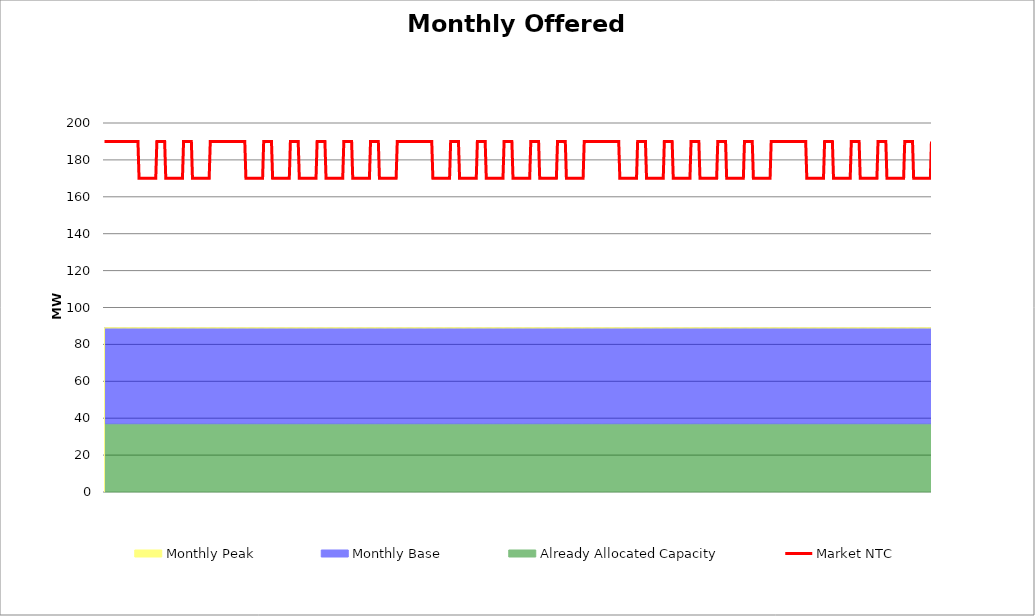
| Category | Market NTC |
|---|---|
| 0 | 190 |
| 1 | 190 |
| 2 | 190 |
| 3 | 190 |
| 4 | 190 |
| 5 | 190 |
| 6 | 190 |
| 7 | 190 |
| 8 | 190 |
| 9 | 190 |
| 10 | 190 |
| 11 | 190 |
| 12 | 190 |
| 13 | 190 |
| 14 | 190 |
| 15 | 190 |
| 16 | 190 |
| 17 | 190 |
| 18 | 190 |
| 19 | 190 |
| 20 | 190 |
| 21 | 190 |
| 22 | 190 |
| 23 | 190 |
| 24 | 190 |
| 25 | 190 |
| 26 | 190 |
| 27 | 190 |
| 28 | 190 |
| 29 | 190 |
| 30 | 190 |
| 31 | 170 |
| 32 | 170 |
| 33 | 170 |
| 34 | 170 |
| 35 | 170 |
| 36 | 170 |
| 37 | 170 |
| 38 | 170 |
| 39 | 170 |
| 40 | 170 |
| 41 | 170 |
| 42 | 170 |
| 43 | 170 |
| 44 | 170 |
| 45 | 170 |
| 46 | 170 |
| 47 | 190 |
| 48 | 190 |
| 49 | 190 |
| 50 | 190 |
| 51 | 190 |
| 52 | 190 |
| 53 | 190 |
| 54 | 190 |
| 55 | 170 |
| 56 | 170 |
| 57 | 170 |
| 58 | 170 |
| 59 | 170 |
| 60 | 170 |
| 61 | 170 |
| 62 | 170 |
| 63 | 170 |
| 64 | 170 |
| 65 | 170 |
| 66 | 170 |
| 67 | 170 |
| 68 | 170 |
| 69 | 170 |
| 70 | 170 |
| 71 | 190 |
| 72 | 190 |
| 73 | 190 |
| 74 | 190 |
| 75 | 190 |
| 76 | 190 |
| 77 | 190 |
| 78 | 190 |
| 79 | 170 |
| 80 | 170 |
| 81 | 170 |
| 82 | 170 |
| 83 | 170 |
| 84 | 170 |
| 85 | 170 |
| 86 | 170 |
| 87 | 170 |
| 88 | 170 |
| 89 | 170 |
| 90 | 170 |
| 91 | 170 |
| 92 | 170 |
| 93 | 170 |
| 94 | 170 |
| 95 | 190 |
| 96 | 190 |
| 97 | 190 |
| 98 | 190 |
| 99 | 190 |
| 100 | 190 |
| 101 | 190 |
| 102 | 190 |
| 103 | 190 |
| 104 | 190 |
| 105 | 190 |
| 106 | 190 |
| 107 | 190 |
| 108 | 190 |
| 109 | 190 |
| 110 | 190 |
| 111 | 190 |
| 112 | 190 |
| 113 | 190 |
| 114 | 190 |
| 115 | 190 |
| 116 | 190 |
| 117 | 190 |
| 118 | 190 |
| 119 | 190 |
| 120 | 190 |
| 121 | 190 |
| 122 | 190 |
| 123 | 190 |
| 124 | 190 |
| 125 | 190 |
| 126 | 190 |
| 127 | 170 |
| 128 | 170 |
| 129 | 170 |
| 130 | 170 |
| 131 | 170 |
| 132 | 170 |
| 133 | 170 |
| 134 | 170 |
| 135 | 170 |
| 136 | 170 |
| 137 | 170 |
| 138 | 170 |
| 139 | 170 |
| 140 | 170 |
| 141 | 170 |
| 142 | 170 |
| 143 | 190 |
| 144 | 190 |
| 145 | 190 |
| 146 | 190 |
| 147 | 190 |
| 148 | 190 |
| 149 | 190 |
| 150 | 190 |
| 151 | 170 |
| 152 | 170 |
| 153 | 170 |
| 154 | 170 |
| 155 | 170 |
| 156 | 170 |
| 157 | 170 |
| 158 | 170 |
| 159 | 170 |
| 160 | 170 |
| 161 | 170 |
| 162 | 170 |
| 163 | 170 |
| 164 | 170 |
| 165 | 170 |
| 166 | 170 |
| 167 | 190 |
| 168 | 190 |
| 169 | 190 |
| 170 | 190 |
| 171 | 190 |
| 172 | 190 |
| 173 | 190 |
| 174 | 190 |
| 175 | 170 |
| 176 | 170 |
| 177 | 170 |
| 178 | 170 |
| 179 | 170 |
| 180 | 170 |
| 181 | 170 |
| 182 | 170 |
| 183 | 170 |
| 184 | 170 |
| 185 | 170 |
| 186 | 170 |
| 187 | 170 |
| 188 | 170 |
| 189 | 170 |
| 190 | 170 |
| 191 | 190 |
| 192 | 190 |
| 193 | 190 |
| 194 | 190 |
| 195 | 190 |
| 196 | 190 |
| 197 | 190 |
| 198 | 190 |
| 199 | 170 |
| 200 | 170 |
| 201 | 170 |
| 202 | 170 |
| 203 | 170 |
| 204 | 170 |
| 205 | 170 |
| 206 | 170 |
| 207 | 170 |
| 208 | 170 |
| 209 | 170 |
| 210 | 170 |
| 211 | 170 |
| 212 | 170 |
| 213 | 170 |
| 214 | 170 |
| 215 | 190 |
| 216 | 190 |
| 217 | 190 |
| 218 | 190 |
| 219 | 190 |
| 220 | 190 |
| 221 | 190 |
| 222 | 190 |
| 223 | 170 |
| 224 | 170 |
| 225 | 170 |
| 226 | 170 |
| 227 | 170 |
| 228 | 170 |
| 229 | 170 |
| 230 | 170 |
| 231 | 170 |
| 232 | 170 |
| 233 | 170 |
| 234 | 170 |
| 235 | 170 |
| 236 | 170 |
| 237 | 170 |
| 238 | 170 |
| 239 | 190 |
| 240 | 190 |
| 241 | 190 |
| 242 | 190 |
| 243 | 190 |
| 244 | 190 |
| 245 | 190 |
| 246 | 190 |
| 247 | 170 |
| 248 | 170 |
| 249 | 170 |
| 250 | 170 |
| 251 | 170 |
| 252 | 170 |
| 253 | 170 |
| 254 | 170 |
| 255 | 170 |
| 256 | 170 |
| 257 | 170 |
| 258 | 170 |
| 259 | 170 |
| 260 | 170 |
| 261 | 170 |
| 262 | 170 |
| 263 | 190 |
| 264 | 190 |
| 265 | 190 |
| 266 | 190 |
| 267 | 190 |
| 268 | 190 |
| 269 | 190 |
| 270 | 190 |
| 271 | 190 |
| 272 | 190 |
| 273 | 190 |
| 274 | 190 |
| 275 | 190 |
| 276 | 190 |
| 277 | 190 |
| 278 | 190 |
| 279 | 190 |
| 280 | 190 |
| 281 | 190 |
| 282 | 190 |
| 283 | 190 |
| 284 | 190 |
| 285 | 190 |
| 286 | 190 |
| 287 | 190 |
| 288 | 190 |
| 289 | 190 |
| 290 | 190 |
| 291 | 190 |
| 292 | 190 |
| 293 | 190 |
| 294 | 190 |
| 295 | 170 |
| 296 | 170 |
| 297 | 170 |
| 298 | 170 |
| 299 | 170 |
| 300 | 170 |
| 301 | 170 |
| 302 | 170 |
| 303 | 170 |
| 304 | 170 |
| 305 | 170 |
| 306 | 170 |
| 307 | 170 |
| 308 | 170 |
| 309 | 170 |
| 310 | 170 |
| 311 | 190 |
| 312 | 190 |
| 313 | 190 |
| 314 | 190 |
| 315 | 190 |
| 316 | 190 |
| 317 | 190 |
| 318 | 190 |
| 319 | 170 |
| 320 | 170 |
| 321 | 170 |
| 322 | 170 |
| 323 | 170 |
| 324 | 170 |
| 325 | 170 |
| 326 | 170 |
| 327 | 170 |
| 328 | 170 |
| 329 | 170 |
| 330 | 170 |
| 331 | 170 |
| 332 | 170 |
| 333 | 170 |
| 334 | 170 |
| 335 | 190 |
| 336 | 190 |
| 337 | 190 |
| 338 | 190 |
| 339 | 190 |
| 340 | 190 |
| 341 | 190 |
| 342 | 190 |
| 343 | 170 |
| 344 | 170 |
| 345 | 170 |
| 346 | 170 |
| 347 | 170 |
| 348 | 170 |
| 349 | 170 |
| 350 | 170 |
| 351 | 170 |
| 352 | 170 |
| 353 | 170 |
| 354 | 170 |
| 355 | 170 |
| 356 | 170 |
| 357 | 170 |
| 358 | 170 |
| 359 | 190 |
| 360 | 190 |
| 361 | 190 |
| 362 | 190 |
| 363 | 190 |
| 364 | 190 |
| 365 | 190 |
| 366 | 190 |
| 367 | 170 |
| 368 | 170 |
| 369 | 170 |
| 370 | 170 |
| 371 | 170 |
| 372 | 170 |
| 373 | 170 |
| 374 | 170 |
| 375 | 170 |
| 376 | 170 |
| 377 | 170 |
| 378 | 170 |
| 379 | 170 |
| 380 | 170 |
| 381 | 170 |
| 382 | 170 |
| 383 | 190 |
| 384 | 190 |
| 385 | 190 |
| 386 | 190 |
| 387 | 190 |
| 388 | 190 |
| 389 | 190 |
| 390 | 190 |
| 391 | 170 |
| 392 | 170 |
| 393 | 170 |
| 394 | 170 |
| 395 | 170 |
| 396 | 170 |
| 397 | 170 |
| 398 | 170 |
| 399 | 170 |
| 400 | 170 |
| 401 | 170 |
| 402 | 170 |
| 403 | 170 |
| 404 | 170 |
| 405 | 170 |
| 406 | 170 |
| 407 | 190 |
| 408 | 190 |
| 409 | 190 |
| 410 | 190 |
| 411 | 190 |
| 412 | 190 |
| 413 | 190 |
| 414 | 190 |
| 415 | 170 |
| 416 | 170 |
| 417 | 170 |
| 418 | 170 |
| 419 | 170 |
| 420 | 170 |
| 421 | 170 |
| 422 | 170 |
| 423 | 170 |
| 424 | 170 |
| 425 | 170 |
| 426 | 170 |
| 427 | 170 |
| 428 | 170 |
| 429 | 170 |
| 430 | 170 |
| 431 | 190 |
| 432 | 190 |
| 433 | 190 |
| 434 | 190 |
| 435 | 190 |
| 436 | 190 |
| 437 | 190 |
| 438 | 190 |
| 439 | 190 |
| 440 | 190 |
| 441 | 190 |
| 442 | 190 |
| 443 | 190 |
| 444 | 190 |
| 445 | 190 |
| 446 | 190 |
| 447 | 190 |
| 448 | 190 |
| 449 | 190 |
| 450 | 190 |
| 451 | 190 |
| 452 | 190 |
| 453 | 190 |
| 454 | 190 |
| 455 | 190 |
| 456 | 190 |
| 457 | 190 |
| 458 | 190 |
| 459 | 190 |
| 460 | 190 |
| 461 | 190 |
| 462 | 190 |
| 463 | 170 |
| 464 | 170 |
| 465 | 170 |
| 466 | 170 |
| 467 | 170 |
| 468 | 170 |
| 469 | 170 |
| 470 | 170 |
| 471 | 170 |
| 472 | 170 |
| 473 | 170 |
| 474 | 170 |
| 475 | 170 |
| 476 | 170 |
| 477 | 170 |
| 478 | 170 |
| 479 | 190 |
| 480 | 190 |
| 481 | 190 |
| 482 | 190 |
| 483 | 190 |
| 484 | 190 |
| 485 | 190 |
| 486 | 190 |
| 487 | 170 |
| 488 | 170 |
| 489 | 170 |
| 490 | 170 |
| 491 | 170 |
| 492 | 170 |
| 493 | 170 |
| 494 | 170 |
| 495 | 170 |
| 496 | 170 |
| 497 | 170 |
| 498 | 170 |
| 499 | 170 |
| 500 | 170 |
| 501 | 170 |
| 502 | 170 |
| 503 | 190 |
| 504 | 190 |
| 505 | 190 |
| 506 | 190 |
| 507 | 190 |
| 508 | 190 |
| 509 | 190 |
| 510 | 190 |
| 511 | 170 |
| 512 | 170 |
| 513 | 170 |
| 514 | 170 |
| 515 | 170 |
| 516 | 170 |
| 517 | 170 |
| 518 | 170 |
| 519 | 170 |
| 520 | 170 |
| 521 | 170 |
| 522 | 170 |
| 523 | 170 |
| 524 | 170 |
| 525 | 170 |
| 526 | 170 |
| 527 | 190 |
| 528 | 190 |
| 529 | 190 |
| 530 | 190 |
| 531 | 190 |
| 532 | 190 |
| 533 | 190 |
| 534 | 190 |
| 535 | 170 |
| 536 | 170 |
| 537 | 170 |
| 538 | 170 |
| 539 | 170 |
| 540 | 170 |
| 541 | 170 |
| 542 | 170 |
| 543 | 170 |
| 544 | 170 |
| 545 | 170 |
| 546 | 170 |
| 547 | 170 |
| 548 | 170 |
| 549 | 170 |
| 550 | 170 |
| 551 | 190 |
| 552 | 190 |
| 553 | 190 |
| 554 | 190 |
| 555 | 190 |
| 556 | 190 |
| 557 | 190 |
| 558 | 190 |
| 559 | 170 |
| 560 | 170 |
| 561 | 170 |
| 562 | 170 |
| 563 | 170 |
| 564 | 170 |
| 565 | 170 |
| 566 | 170 |
| 567 | 170 |
| 568 | 170 |
| 569 | 170 |
| 570 | 170 |
| 571 | 170 |
| 572 | 170 |
| 573 | 170 |
| 574 | 170 |
| 575 | 190 |
| 576 | 190 |
| 577 | 190 |
| 578 | 190 |
| 579 | 190 |
| 580 | 190 |
| 581 | 190 |
| 582 | 190 |
| 583 | 170 |
| 584 | 170 |
| 585 | 170 |
| 586 | 170 |
| 587 | 170 |
| 588 | 170 |
| 589 | 170 |
| 590 | 170 |
| 591 | 170 |
| 592 | 170 |
| 593 | 170 |
| 594 | 170 |
| 595 | 170 |
| 596 | 170 |
| 597 | 170 |
| 598 | 170 |
| 599 | 190 |
| 600 | 190 |
| 601 | 190 |
| 602 | 190 |
| 603 | 190 |
| 604 | 190 |
| 605 | 190 |
| 606 | 190 |
| 607 | 190 |
| 608 | 190 |
| 609 | 190 |
| 610 | 190 |
| 611 | 190 |
| 612 | 190 |
| 613 | 190 |
| 614 | 190 |
| 615 | 190 |
| 616 | 190 |
| 617 | 190 |
| 618 | 190 |
| 619 | 190 |
| 620 | 190 |
| 621 | 190 |
| 622 | 190 |
| 623 | 190 |
| 624 | 190 |
| 625 | 190 |
| 626 | 190 |
| 627 | 190 |
| 628 | 190 |
| 629 | 190 |
| 630 | 190 |
| 631 | 170 |
| 632 | 170 |
| 633 | 170 |
| 634 | 170 |
| 635 | 170 |
| 636 | 170 |
| 637 | 170 |
| 638 | 170 |
| 639 | 170 |
| 640 | 170 |
| 641 | 170 |
| 642 | 170 |
| 643 | 170 |
| 644 | 170 |
| 645 | 170 |
| 646 | 170 |
| 647 | 190 |
| 648 | 190 |
| 649 | 190 |
| 650 | 190 |
| 651 | 190 |
| 652 | 190 |
| 653 | 190 |
| 654 | 190 |
| 655 | 170 |
| 656 | 170 |
| 657 | 170 |
| 658 | 170 |
| 659 | 170 |
| 660 | 170 |
| 661 | 170 |
| 662 | 170 |
| 663 | 170 |
| 664 | 170 |
| 665 | 170 |
| 666 | 170 |
| 667 | 170 |
| 668 | 170 |
| 669 | 170 |
| 670 | 170 |
| 671 | 190 |
| 672 | 190 |
| 673 | 190 |
| 674 | 190 |
| 675 | 190 |
| 676 | 190 |
| 677 | 190 |
| 678 | 190 |
| 679 | 170 |
| 680 | 170 |
| 681 | 170 |
| 682 | 170 |
| 683 | 170 |
| 684 | 170 |
| 685 | 170 |
| 686 | 170 |
| 687 | 170 |
| 688 | 170 |
| 689 | 170 |
| 690 | 170 |
| 691 | 170 |
| 692 | 170 |
| 693 | 170 |
| 694 | 170 |
| 695 | 190 |
| 696 | 190 |
| 697 | 190 |
| 698 | 190 |
| 699 | 190 |
| 700 | 190 |
| 701 | 190 |
| 702 | 190 |
| 703 | 170 |
| 704 | 170 |
| 705 | 170 |
| 706 | 170 |
| 707 | 170 |
| 708 | 170 |
| 709 | 170 |
| 710 | 170 |
| 711 | 170 |
| 712 | 170 |
| 713 | 170 |
| 714 | 170 |
| 715 | 170 |
| 716 | 170 |
| 717 | 170 |
| 718 | 170 |
| 719 | 190 |
| 720 | 190 |
| 721 | 190 |
| 722 | 190 |
| 723 | 190 |
| 724 | 190 |
| 725 | 190 |
| 726 | 190 |
| 727 | 170 |
| 728 | 170 |
| 729 | 170 |
| 730 | 170 |
| 731 | 170 |
| 732 | 170 |
| 733 | 170 |
| 734 | 170 |
| 735 | 170 |
| 736 | 170 |
| 737 | 170 |
| 738 | 170 |
| 739 | 170 |
| 740 | 170 |
| 741 | 170 |
| 742 | 170 |
| 743 | 190 |